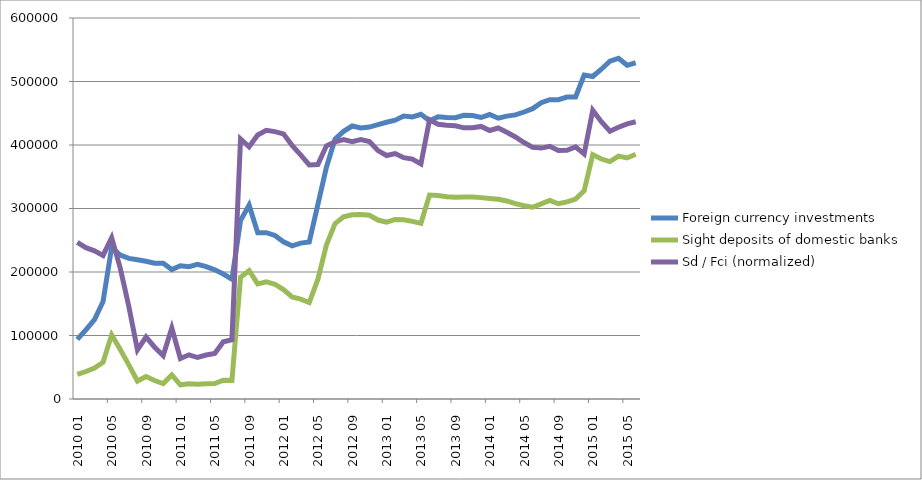
| Category | Foreign currency investments | Sight deposits of domestic banks | Sd / Fci (normalized) |
|---|---|---|---|
| 2010-01-31 | 93894.825 | 38609.444 | 246719.313 |
| 2010-02-28 | 108929.837 | 43267.806 | 238324.818 |
| 2010-03-31 | 125088.591 | 48632.405 | 233270.219 |
| 2010-04-30 | 153581.597 | 57865.466 | 226064.061 |
| 2010-05-31 | 238786.446 | 101111.38 | 254063.114 |
| 2010-06-30 | 226657.739 | 77838.982 | 206052.479 |
| 2010-07-31 | 221375.364 | 53705.154 | 145558.618 |
| 2010-08-31 | 219300.407 | 28269.54 | 77344.698 |
| 2010-09-30 | 216822.523 | 35277.246 | 97620.612 |
| 2010-10-31 | 213725.459 | 29066.44 | 81599.376 |
| 2010-11-30 | 213774.521 | 24402.126 | 68489.338 |
| 2010-12-31 | 203809.644 | 37950.724 | 111724.027 |
| 2011-01-31 | 209902.764 | 22322.795 | 63808.959 |
| 2011-02-28 | 208326.086 | 24160.757 | 69585.4 |
| 2011-03-31 | 211918.051 | 23076.39 | 65335.794 |
| 2011-04-30 | 208396.218 | 24041.747 | 69219.338 |
| 2011-05-31 | 203385.298 | 24259.818 | 71568.057 |
| 2011-06-30 | 196848.798 | 29576.361 | 90149.48 |
| 2011-07-31 | 188734.835 | 29381.943 | 93407.057 |
| 2011-08-31 | 280981.989 | 191763.546 | 409485.776 |
| 2011-09-30 | 305281.477 | 202117.851 | 397242.282 |
| 2011-10-31 | 261815.382 | 181381.807 | 415671.087 |
| 2011-11-30 | 261949.749 | 184684.5 | 423022.738 |
| 2011-12-31 | 257504.165 | 180720.743 | 421090.066 |
| 2012-01-31 | 247484.028 | 172223.734 | 417539.026 |
| 2012-02-29 | 241236.635 | 160612.308 | 399472.429 |
| 2012-03-31 | 245498.529 | 157347.441 | 384558.168 |
| 2012-04-30 | 247218.373 | 151897.208 | 368655.143 |
| 2012-05-31 | 306147.797 | 188361.25 | 369157.482 |
| 2012-06-30 | 365055.746 | 242629.403 | 398781.949 |
| 2012-07-31 | 409188.552 | 276109.221 | 404863.557 |
| 2012-08-31 | 421573.448 | 286970.645 | 408427.968 |
| 2012-09-30 | 429917.71 | 290229.543 | 405048.971 |
| 2012-10-31 | 426769.453 | 290496.571 | 408412.414 |
| 2012-11-30 | 428253.096 | 289294.783 | 405313.753 |
| 2012-12-31 | 432208.904 | 281814.056 | 391219.228 |
| 2013-01-31 | 435882.73 | 278544.827 | 383421.697 |
| 2013-02-28 | 439066.212 | 282837.072 | 386507.179 |
| 2013-03-31 | 445585.249 | 282240.429 | 380049.065 |
| 2013-04-30 | 444254.583 | 279716.104 | 377778.123 |
| 2013-05-31 | 448348.555 | 276625.808 | 370192.974 |
| 2013-06-30 | 438177.45 | 321115.994 | 439706.782 |
| 2013-07-31 | 444348.938 | 320437.692 | 432683.864 |
| 2013-08-31 | 443418.703 | 318533.944 | 431015.573 |
| 2013-09-30 | 443070.613 | 317757.582 | 430302.854 |
| 2013-10-31 | 446798.249 | 317967.489 | 426994.721 |
| 2013-11-30 | 446420.246 | 317949.671 | 427332.327 |
| 2013-12-31 | 443274.518 | 317131.684 | 429257.724 |
| 2014-01-31 | 447978.381 | 315678.66 | 422804.323 |
| 2014-02-28 | 442151.144 | 314482.427 | 426753.291 |
| 2014-03-31 | 445479.56 | 311897.969 | 420083.879 |
| 2014-04-30 | 447444.803 | 307677.564 | 412579.468 |
| 2014-05-31 | 451952.496 | 304263.423 | 403931.952 |
| 2014-06-30 | 457215.857 | 301977.972 | 396282.807 |
| 2014-07-31 | 466618.098 | 307282.835 | 395119.053 |
| 2014-08-31 | 471385.236 | 312702.889 | 398022.083 |
| 2014-09-30 | 471452.308 | 307459.256 | 391292.079 |
| 2014-10-31 | 475585.666 | 310472.19 | 391692.448 |
| 2014-11-30 | 475727.833 | 314843.24 | 397088.274 |
| 2014-12-31 | 510062.407 | 328006.197 | 385842.43 |
| 2015-01-31 | 507856.149 | 384820.913 | 454641.631 |
| 2015-02-28 | 519330.244 | 377887.76 | 436586.658 |
| 2015-03-31 | 531911.39 | 373918.03 | 421782.316 |
| 2015-04-30 | 536364.095 | 382580.383 | 427970.91 |
| 2015-05-31 | 525478.934 | 379542.364 | 433367.36 |
| 2015-06-30 | 529520.61 | 385354.828 | 436645.7 |